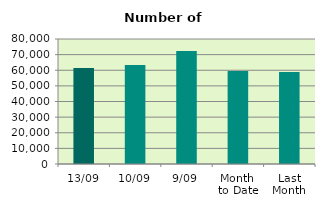
| Category | Series 0 |
|---|---|
| 13/09 | 61496 |
| 10/09 | 63348 |
| 9/09 | 72374 |
| Month 
to Date | 59506.444 |
| Last
Month | 58874.818 |